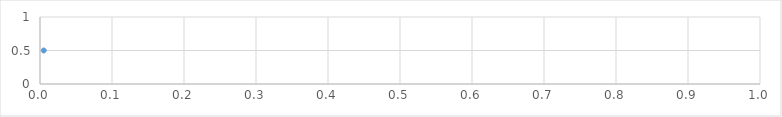
| Category | Series 0 |
|---|---|
| 0.005161390397846355 | 0.5 |